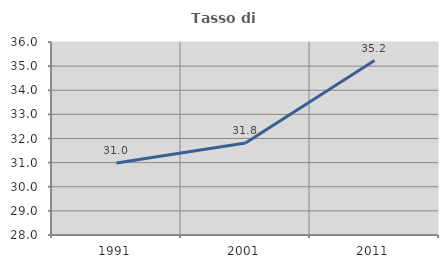
| Category | Tasso di occupazione   |
|---|---|
| 1991.0 | 30.981 |
| 2001.0 | 31.815 |
| 2011.0 | 35.232 |